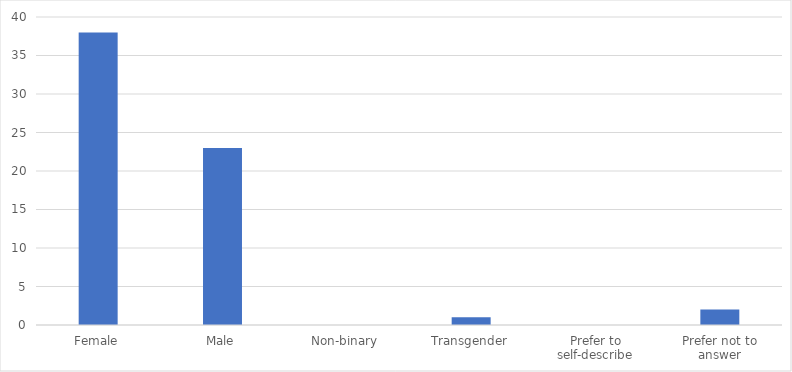
| Category | Number of Responses |
|---|---|
| Female | 38 |
| Male | 23 |
| Non-binary | 0 |
| Transgender | 1 |
| Prefer to self-describe | 0 |
| Prefer not to answer | 2 |